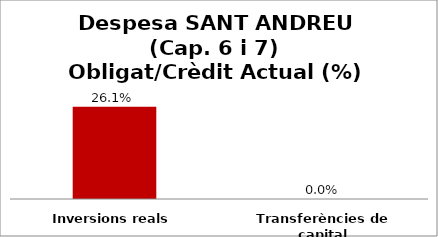
| Category | Series 0 |
|---|---|
| Inversions reals | 0.261 |
| Transferències de capital | 0 |